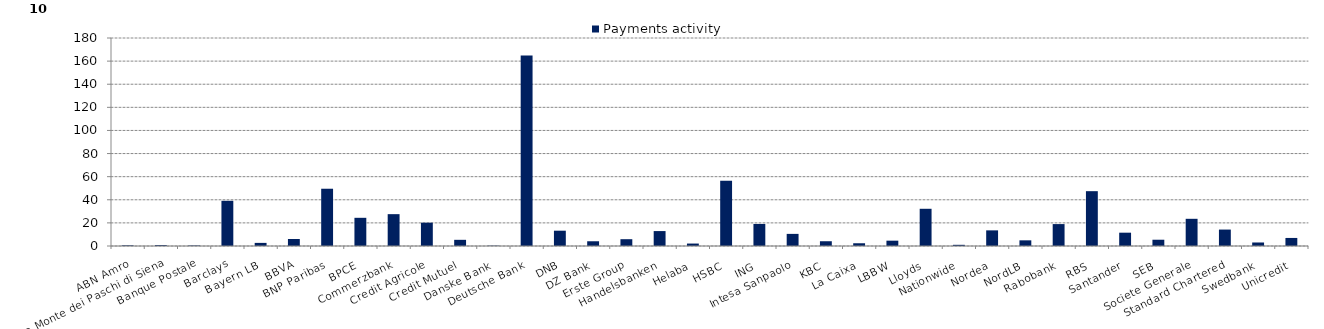
| Category | Payments activity  |
|---|---|
| ABN Amro | 574979.281 |
| Banca Monte dei Paschi di Siena | 784561.171 |
| Banque Postale | 442880.09 |
| Barclays | 39112492.711 |
| Bayern LB | 2694467.213 |
| BBVA | 6048306.38 |
| BNP Paribas | 49556784.21 |
| BPCE | 24395138.555 |
| Commerzbank | 27556575.861 |
| Credit Agricole | 20175277 |
| Credit Mutuel | 5347472.259 |
| Danske Bank | 290406.172 |
| Deutsche Bank | 164892429.804 |
| DNB | 13245970.683 |
| DZ Bank | 4100120.249 |
| Erste Group | 5888810.952 |
| Handelsbanken | 12918112.162 |
| Helaba | 2116724.614 |
| HSBC | 56572184.994 |
| ING | 19088070.551 |
| Intesa Sanpaolo | 10485571.559 |
| KBC | 4124870.889 |
| La Caixa | 2376029.277 |
| LBBW | 4615120.844 |
| Lloyds | 32207618.698 |
| Nationwide | 1021557.709 |
| Nordea | 13532755.094 |
| NordLB | 4901116.048 |
| Rabobank | 18966425.467 |
| RBS | 47446896.829 |
| Santander | 11527072.658 |
| SEB | 5428709.183 |
| Societe Generale | 23531908.421 |
| Standard Chartered | 14221183.393 |
| Swedbank | 3043025.485 |
| Unicredit | 6969024.152 |